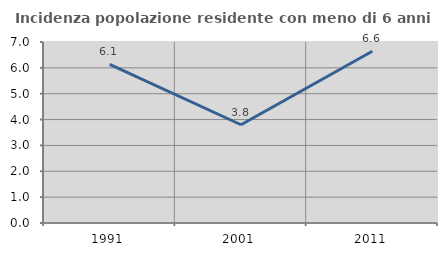
| Category | Incidenza popolazione residente con meno di 6 anni |
|---|---|
| 1991.0 | 6.139 |
| 2001.0 | 3.8 |
| 2011.0 | 6.642 |